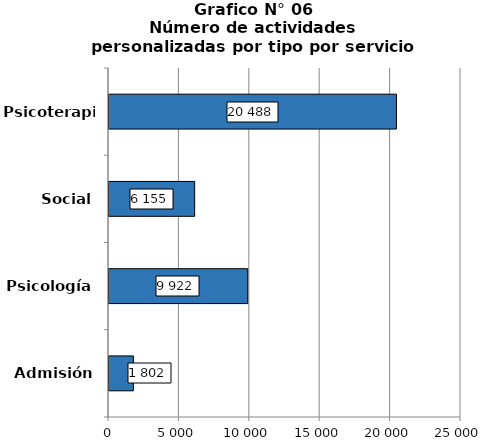
| Category | Series 0 |
|---|---|
| Admisión | 1802 |
| Psicología | 9922 |
| Social | 6155 |
| Psicoterapia | 20488 |